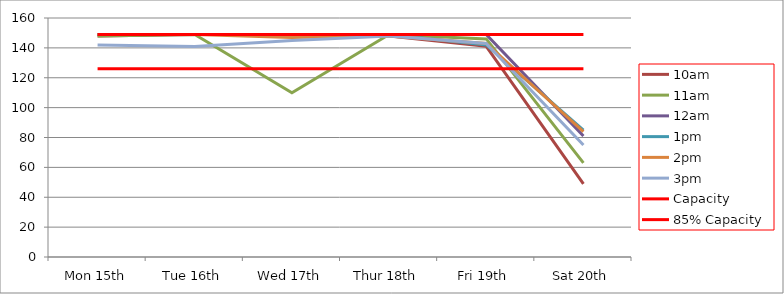
| Category | 9am | 10am | 11am | 12am | 1pm | 2pm | 3pm | 4pm | 5pm | Capacity | 85% Capacity |
|---|---|---|---|---|---|---|---|---|---|---|---|
| Mon 15th |  | 148 | 148 | 149 | 149 | 149 | 142 |  |  | 149 | 126 |
| Tue 16th |  | 149 | 149 | 149 | 149 | 149 | 141 |  |  | 149 | 126 |
| Wed 17th |  | 149 | 110 | 149 | 149 | 147 | 145 |  |  | 149 | 126 |
| Thur 18th |  | 148 | 149 | 149 | 149 | 148 | 148 |  |  | 149 | 126 |
| Fri 19th |  | 141 | 146 | 149 | 142 | 143 | 143 |  |  | 149 | 126 |
| Sat 20th |  | 49 | 63 | 81 | 85 | 84 | 75 |  |  | 149 | 126 |